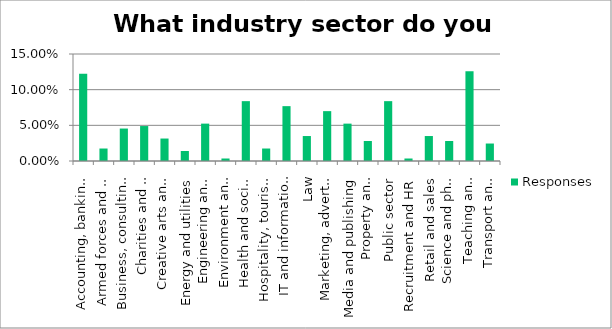
| Category | Responses |
|---|---|
| Accounting, banking and finance | 0.122 |
| Armed forces and emergency services | 0.018 |
| Business, consulting and management | 0.046 |
| Charities and voluntary work | 0.049 |
| Creative arts and culture | 0.032 |
| Energy and utilities | 0.014 |
| Engineering and manufacturing | 0.052 |
| Environment and agriculture | 0.004 |
| Health and social care | 0.084 |
| Hospitality, tourism and sport | 0.018 |
| IT and information services | 0.077 |
| Law | 0.035 |
| Marketing, advertising and PR | 0.07 |
| Media and publishing | 0.052 |
| Property and construction | 0.028 |
| Public sector | 0.084 |
| Recruitment and HR | 0.004 |
| Retail and sales | 0.035 |
| Science and pharmaceuticals | 0.028 |
| Teaching and education | 0.126 |
| Transport and logistics | 0.024 |